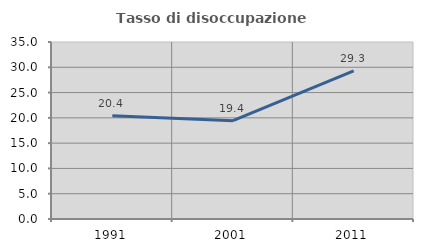
| Category | Tasso di disoccupazione giovanile  |
|---|---|
| 1991.0 | 20.408 |
| 2001.0 | 19.444 |
| 2011.0 | 29.268 |